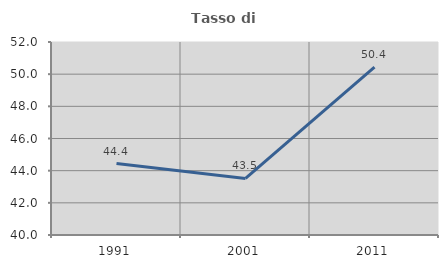
| Category | Tasso di occupazione   |
|---|---|
| 1991.0 | 44.444 |
| 2001.0 | 43.519 |
| 2011.0 | 50.442 |